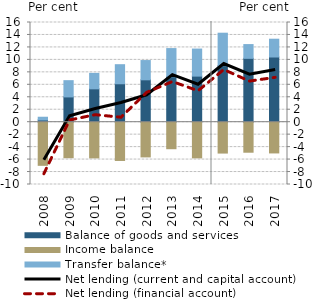
| Category | Balance of goods and services | Income balance | Transfer balance* |
|---|---|---|---|
| 2008.0 | 0.359 | -6.923 | 0.437 |
| 2009.0 | 4.056 | -5.703 | 2.608 |
| 2010.0 | 5.354 | -5.729 | 2.482 |
| 2011.0 | 6.167 | -6.144 | 3.061 |
| 2012.0 | 6.802 | -5.573 | 3.091 |
| 2013.0 | 7.299 | -4.256 | 4.514 |
| 2014.0 | 7.395 | -5.725 | 4.343 |
| 2015.0 | 9.081 | -4.956 | 5.201 |
| 2016.0 | 10.248 | -4.82 | 2.208 |
| 2017.0 | 10.462 | -4.934 | 2.857 |